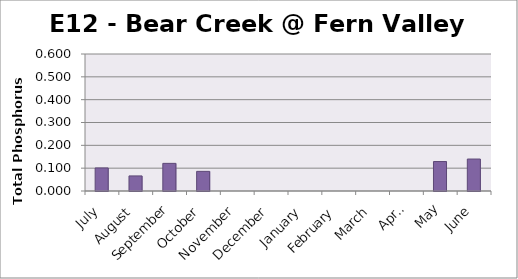
| Category | Phosphorus (mg/L) |
|---|---|
| July | 0.101 |
| August | 0.066 |
| September | 0.121 |
| October | 0.086 |
| November | 0 |
| December | 0 |
| January | 0 |
| February | 0 |
| March | 0 |
| April | 0 |
| May | 0.129 |
| June | 0.14 |